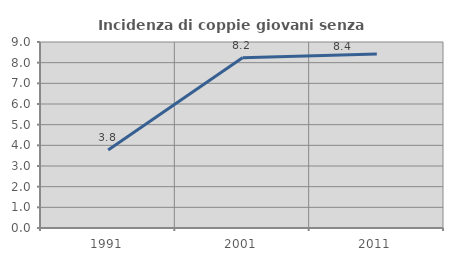
| Category | Incidenza di coppie giovani senza figli |
|---|---|
| 1991.0 | 3.774 |
| 2001.0 | 8.24 |
| 2011.0 | 8.421 |